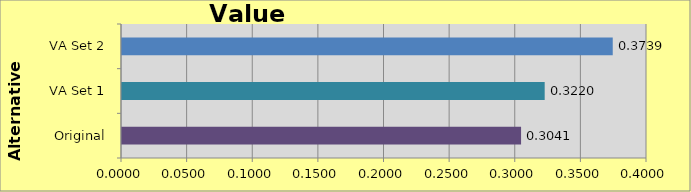
| Category | Original VA Set 1 VA Set 2 |
|---|---|
| Original | 0.304 |
| VA Set 1 | 0.322 |
| VA Set 2 | 0.374 |